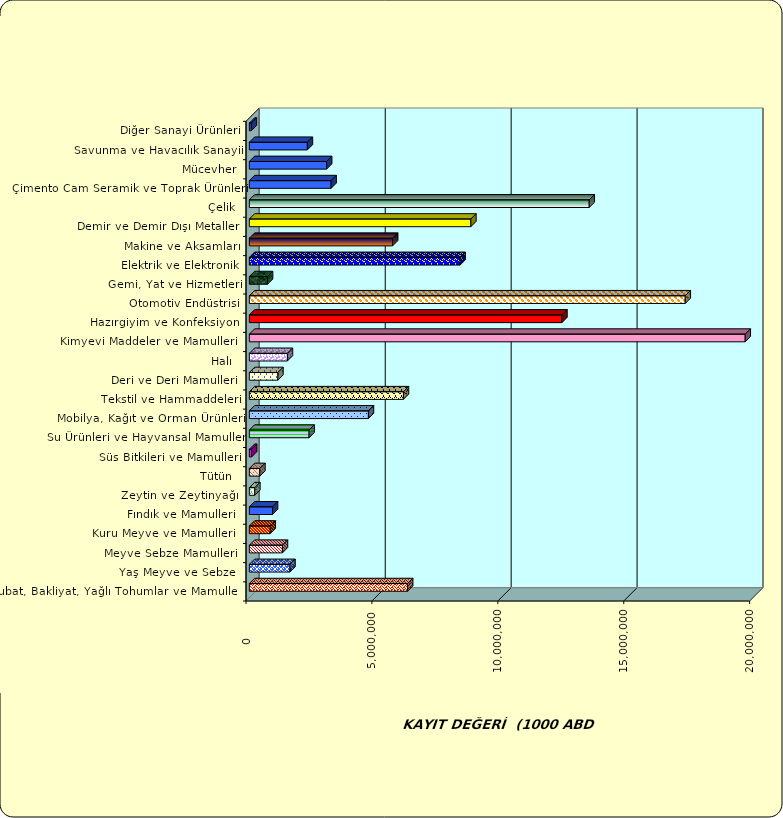
| Category | Series 0 |
|---|---|
|  Hububat, Bakliyat, Yağlı Tohumlar ve Mamulleri  | 6285720.624 |
|  Yaş Meyve ve Sebze   | 1613568.753 |
|  Meyve Sebze Mamulleri  | 1314117.676 |
|  Kuru Meyve ve Mamulleri   | 829750.196 |
|  Fındık ve Mamulleri  | 920871.873 |
|  Zeytin ve Zeytinyağı  | 217093.095 |
|  Tütün  | 419024.513 |
|  Süs Bitkileri ve Mamulleri | 90183.547 |
|  Su Ürünleri ve Hayvansal Mamuller | 2371984.966 |
|  Mobilya, Kağıt ve Orman Ürünleri | 4728597.703 |
|  Tekstil ve Hammaddeleri | 6118933.82 |
|  Deri ve Deri Mamulleri  | 1134014.194 |
|  Halı  | 1512016.96 |
|  Kimyevi Maddeler ve Mamulleri   | 19690259.674 |
|  Hazırgiyim ve Konfeksiyon  | 12410895.179 |
|  Otomotiv Endüstrisi | 17309793.048 |
|  Gemi, Yat ve Hizmetleri | 722375.444 |
|  Elektrik ve Elektronik | 8369140.63 |
|  Makine ve Aksamları | 5688484.867 |
|  Demir ve Demir Dışı Metaller  | 8796104.551 |
|  Çelik | 13496180.515 |
|  Çimento Cam Seramik ve Toprak Ürünleri | 3246829.684 |
|  Mücevher | 3068879.128 |
|  Savunma ve Havacılık Sanayii | 2303915.245 |
|  Diğer Sanayi Ürünleri | 78231.027 |